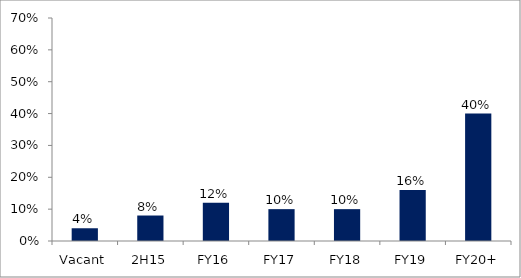
| Category | Series 0 |
|---|---|
| Vacant | 0.04 |
| 2H15 | 0.08 |
| FY16 | 0.12 |
| FY17 | 0.1 |
| FY18 | 0.1 |
| FY19 | 0.16 |
| FY20+ | 0.4 |